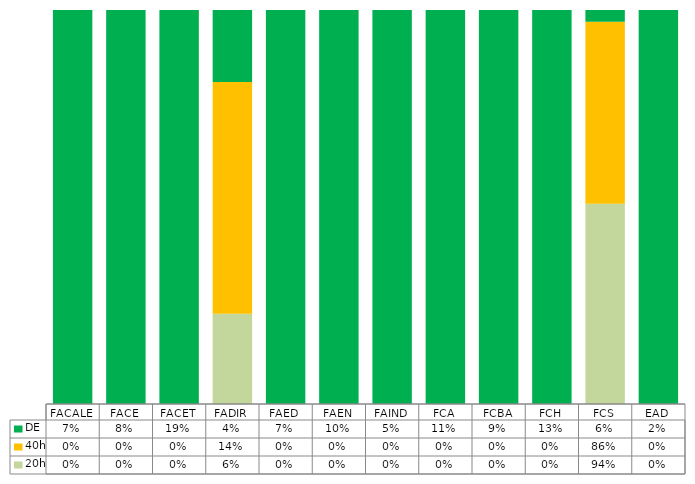
| Category | 20h | 40h | DE |
|---|---|---|---|
| FACALE | 0 | 0 | 0.069 |
| FACE | 0 | 0 | 0.076 |
| FACET | 0 | 0 | 0.185 |
| FADIR | 0.056 | 0.143 | 0.044 |
| FAED | 0 | 0 | 0.072 |
| FAEN | 0 | 0 | 0.104 |
| FAIND | 0 | 0 | 0.046 |
| FCA | 0 | 0 | 0.113 |
| FCBA | 0 | 0 | 0.087 |
| FCH | 0 | 0 | 0.13 |
| FCS | 0.944 | 0.857 | 0.056 |
| EAD | 0 | 0 | 0.019 |